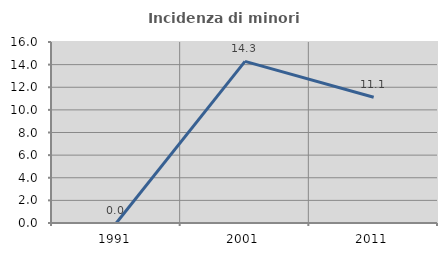
| Category | Incidenza di minori stranieri |
|---|---|
| 1991.0 | 0 |
| 2001.0 | 14.286 |
| 2011.0 | 11.111 |